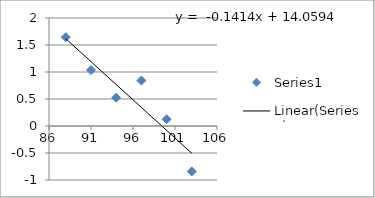
| Category | Series 0 |
|---|---|
| 88.0 | 1.645 |
| 91.0 | 1.036 |
| 94.0 | 0.524 |
| 97.0 | 0.842 |
| 100.0 | 0.126 |
| 103.0 | -0.842 |